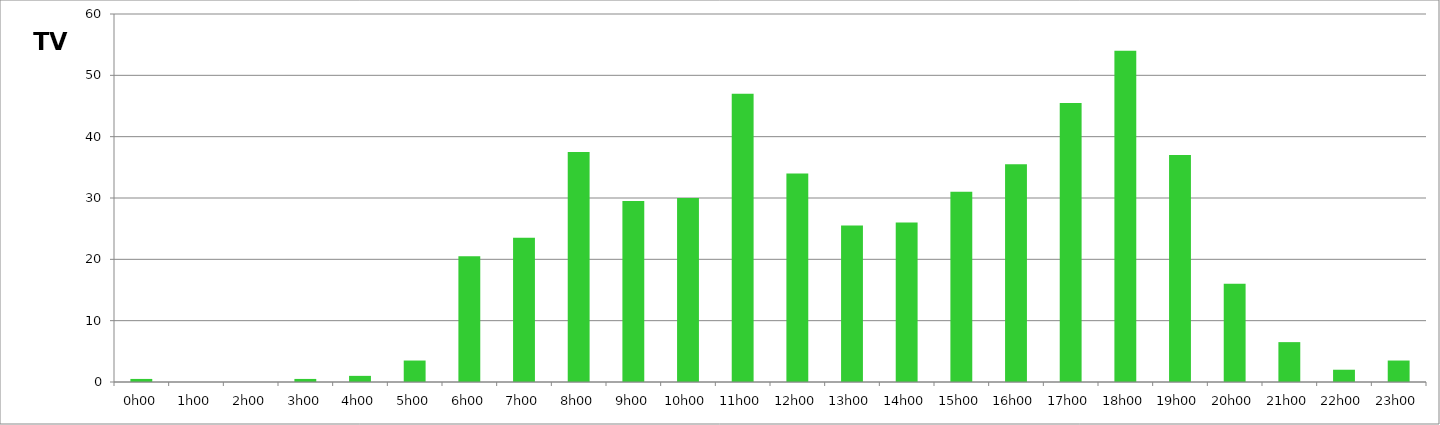
| Category | TV |
|---|---|
| 0.0 | 0.5 |
| 0.041666666666666664 | 0 |
| 0.08333333333333333 | 0 |
| 0.125 | 0.5 |
| 0.16666666666666666 | 1 |
| 0.20833333333333334 | 3.5 |
| 0.25 | 20.5 |
| 0.2916666666666667 | 23.5 |
| 0.3333333333333333 | 37.5 |
| 0.375 | 29.5 |
| 0.4166666666666667 | 30 |
| 0.4583333333333333 | 47 |
| 0.5 | 34 |
| 0.5416666666666666 | 25.5 |
| 0.5833333333333334 | 26 |
| 0.625 | 31 |
| 0.6666666666666666 | 35.5 |
| 0.7083333333333334 | 45.5 |
| 0.75 | 54 |
| 0.7916666666666666 | 37 |
| 0.8333333333333334 | 16 |
| 0.875 | 6.5 |
| 0.9166666666666666 | 2 |
| 0.9583333333333334 | 3.5 |